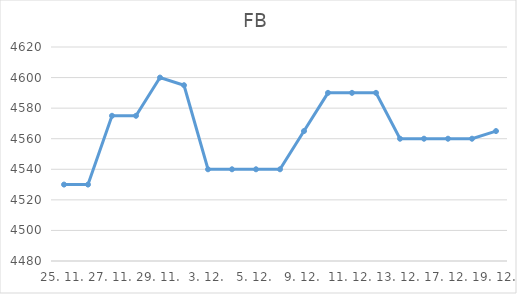
| Category | FB |
|---|---|
| 25. 11. | 4530 |
| 26. 11. | 4530 |
| 27. 11. | 4575 |
| 28. 11. | 4575 |
| 29. 11. | 4600 |
| 2. 12. | 4595 |
| 3. 12. | 4540 |
| 4. 12. | 4540 |
| 5. 12. | 4540 |
| 6. 12. | 4540 |
| 9. 12. | 4565 |
| 10. 12. | 4590 |
| 11. 12. | 4590 |
| 12. 12. | 4590 |
| 13. 12. | 4560 |
| 16. 12. | 4560 |
| 17. 12. | 4560 |
| 18. 12. | 4560 |
| 19. 12. | 4565 |